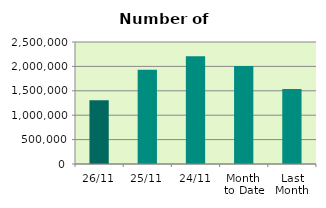
| Category | Series 0 |
|---|---|
| 26/11 | 1306334 |
| 25/11 | 1933510 |
| 24/11 | 2207254 |
| Month 
to Date | 2009234.947 |
| Last
Month | 1538680.909 |